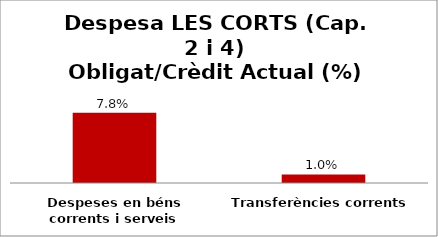
| Category | Series 0 |
|---|---|
| Despeses en béns corrents i serveis | 0.078 |
| Transferències corrents | 0.01 |